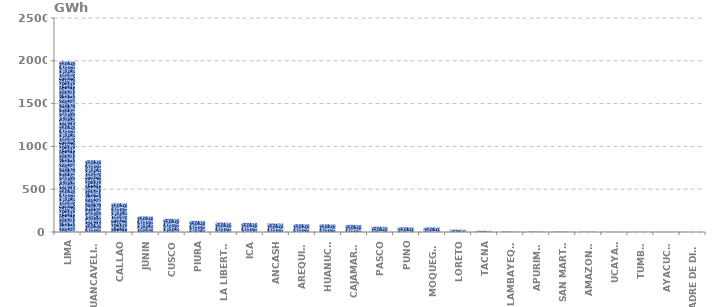
| Category | Series 0 |
|---|---|
| LIMA | 1993.024 |
| HUANCAVELICA | 838.564 |
| CALLAO | 334.918 |
| JUNIN | 181.735 |
| CUSCO | 153.812 |
| PIURA | 129.689 |
| LA LIBERTAD | 109.538 |
| ICA | 106.136 |
| ANCASH | 98.776 |
| AREQUIPA | 91.195 |
| HUANUCO | 88.7 |
| CAJAMARCA | 82.985 |
| PASCO | 61.53 |
| PUNO | 55.178 |
| MOQUEGUA | 53.654 |
| LORETO | 27.625 |
| TACNA | 13.519 |
| LAMBAYEQUE | 4.635 |
| APURIMAC | 4.346 |
| SAN MARTÍN | 4.172 |
| AMAZONAS | 3.155 |
| UCAYALI | 1.628 |
| TUMBES | 1.101 |
| AYACUCHO | 0.884 |
| MADRE DE DIOS | 0.097 |